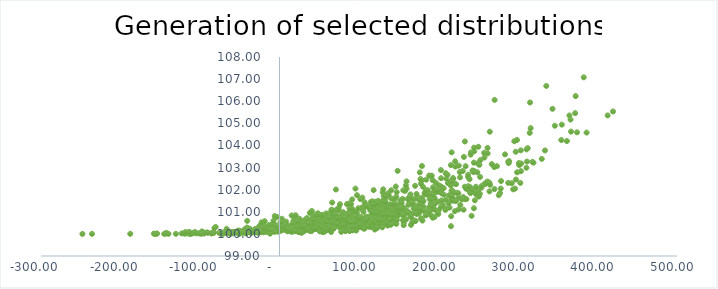
| Category | Correlated var #3 |
|---|---|
| 70.13736574690485 | 100.426 |
| 19.10571041543028 | 100.684 |
| 86.53325265311273 | 100.924 |
| 10.224716042911481 | 100.25 |
| 2.7844434325015612 | 100.472 |
| 50.62324087661004 | 100.227 |
| 135.6689059789775 | 101.107 |
| 28.135895519052667 | 100.163 |
| 111.51120475761911 | 100.426 |
| 3.915789887963953 | 100.482 |
| 206.46240858277238 | 102.068 |
| 72.52647121883795 | 100.448 |
| 96.75893116100633 | 100.522 |
| -82.99420742841542 | 100.074 |
| -21.026460256384823 | 100.263 |
| 132.98011242009767 | 101.541 |
| 100.62409422904001 | 100.522 |
| 35.4702051167384 | 100.345 |
| 66.28497581880447 | 100.454 |
| 142.0679507118041 | 100.706 |
| 48.2429117918072 | 100.931 |
| 220.58543666404887 | 101.027 |
| 163.50356792513918 | 101.389 |
| 66.26154855052383 | 101.419 |
| -11.659527865662781 | 100.102 |
| 121.8125656467173 | 101.257 |
| -42.234055803087216 | 100.022 |
| 16.238188086628583 | 100.183 |
| -31.385115082261564 | 100.089 |
| -19.10894126085067 | 100.204 |
| -123.04203688254728 | 100.021 |
| -63.87497666678976 | 100.066 |
| 364.689727690861 | 105.356 |
| 97.50634531323615 | 101.753 |
| 165.39422335604763 | 100.407 |
| 297.14401497043445 | 103.715 |
| 312.27854869371464 | 103.877 |
| 100.6996378911826 | 100.308 |
| 9.571786296818019 | 100.269 |
| 242.87250789040664 | 101.994 |
| 182.39015313720392 | 101.053 |
| 129.88131604136703 | 100.742 |
| -35.29739287146626 | 100.074 |
| -83.29278447788343 | 100.049 |
| 172.62753446745387 | 101.126 |
| -24.391184821393054 | 100.383 |
| 252.63506950674818 | 103.337 |
| 250.57953730473074 | 101.689 |
| 144.9413082034791 | 101.577 |
| -59.74193231537441 | 100.051 |
| 64.8776997184038 | 100.996 |
| 346.33106462406016 | 104.891 |
| 366.7119142921172 | 104.626 |
| 292.21170600949995 | 102.291 |
| 99.66632277146584 | 100.485 |
| 194.96386281601394 | 100.764 |
| -114.37280397930584 | 100.072 |
| 73.74694429238875 | 100.651 |
| 113.14679450857473 | 100.73 |
| 188.6951329966465 | 100.921 |
| 70.08570686742966 | 100.402 |
| 44.158392569535444 | 100.404 |
| -118.5820312265422 | 100.011 |
| 17.62032709282245 | 100.585 |
| 6.766472482448577 | 100.242 |
| 172.86765163948496 | 100.892 |
| 129.30955372293815 | 100.37 |
| 97.4135939539566 | 100.487 |
| 40.2372155583686 | 100.451 |
| 42.303154382710645 | 100.241 |
| 25.366278095030793 | 100.258 |
| 48.302545283291195 | 100.467 |
| -108.50829118722197 | 100.041 |
| 118.38803904547832 | 100.976 |
| 311.28699302898417 | 103.271 |
| 32.51385361896922 | 100.162 |
| 98.20943056783393 | 100.521 |
| 131.30929077411656 | 100.991 |
| 192.67855511253018 | 100.732 |
| -59.52445554793246 | 100.09 |
| 80.46408819243251 | 100.508 |
| 56.30543377817026 | 100.387 |
| 23.486753918768542 | 100.355 |
| 76.15404194591802 | 100.271 |
| 168.6385435145762 | 101.164 |
| 137.28093576583905 | 101.728 |
| 198.5862913346104 | 101.895 |
| 43.99745323735499 | 100.341 |
| 244.54984752789423 | 101.161 |
| 115.58567353495474 | 100.727 |
| 20.77671898499021 | 100.672 |
| 51.7717964494947 | 100.854 |
| 146.10813461751133 | 100.825 |
| 190.10140583664395 | 100.862 |
| 146.12255714842178 | 100.872 |
| 5.866170565615775 | 100.202 |
| 58.88076501131419 | 100.926 |
| 38.13862735725877 | 100.949 |
| 194.57046770484624 | 101.903 |
| 63.25460077799762 | 100.477 |
| 56.09144003197859 | 100.094 |
| 135.2675115737335 | 100.797 |
| 90.78698247925487 | 100.901 |
| 71.27354915416285 | 101.084 |
| 119.60497432876117 | 100.755 |
| 203.1765359950527 | 101.942 |
| 176.49334477884486 | 102.783 |
| 295.39655668883546 | 104.193 |
| 115.79098335229303 | 100.844 |
| 10.588893792287763 | 100.16 |
| 180.56830350712303 | 102.127 |
| 120.23993195863582 | 100.57 |
| 57.17555302798306 | 100.649 |
| 2.9482998637312363 | 100.685 |
| 24.736844905549475 | 100.125 |
| 104.19077606252158 | 101.641 |
| 67.38348586386451 | 100.6 |
| 13.24252883299593 | 100.361 |
| 4.362612274667484 | 100.542 |
| 167.66704454915384 | 100.641 |
| 31.49957929034001 | 100.578 |
| 14.686646985050345 | 100.213 |
| 40.655445754685175 | 100.678 |
| 133.1475974354761 | 100.572 |
| 89.97620372563082 | 101.347 |
| 177.9546321364109 | 102.276 |
| 129.16516056861795 | 101.449 |
| 16.94735356344809 | 100.145 |
| 39.163880494690936 | 100.404 |
| 79.10870584383379 | 100.59 |
| 239.22319487455377 | 101.911 |
| -10.5416446424056 | 100.189 |
| 217.3212510031694 | 101.96 |
| 131.4191993993312 | 100.455 |
| 216.45854129811516 | 101.95 |
| 132.59532355212386 | 101.248 |
| 382.67630440635367 | 107.081 |
| 107.0568915796515 | 101.199 |
| 195.58568765576138 | 101.091 |
| 249.72966513129654 | 101.869 |
| -104.6359125560254 | 100.023 |
| 195.4009483666157 | 101.892 |
| -142.43454668004375 | 100.043 |
| 76.3415294515611 | 100.692 |
| -9.067772901665961 | 100.238 |
| 128.02401958561018 | 100.617 |
| -1.3553971595900833 | 100.215 |
| 200.1879926358933 | 101.071 |
| -25.294426251588305 | 100.19 |
| 68.72858616880092 | 100.636 |
| -31.813937320242502 | 100.145 |
| 319.5228571715467 | 103.22 |
| -97.44651979942478 | 100.11 |
| 135.31400601444733 | 100.856 |
| -97.5189317695282 | 100.021 |
| 47.09119645672516 | 100.617 |
| 142.49903834738754 | 101.176 |
| 58.74775831645704 | 100.666 |
| 235.13456984180496 | 101.573 |
| -17.282878022796694 | 100.114 |
| 148.59941735184228 | 102.851 |
| 73.02441598143572 | 100.446 |
| 90.97508510851208 | 100.175 |
| 94.69331522104395 | 100.734 |
| 71.83127583921595 | 100.503 |
| 177.97862436376226 | 100.698 |
| 333.9598426719032 | 103.774 |
| 95.54349322086105 | 102.05 |
| 134.3359845751809 | 101.308 |
| 90.98024003439659 | 100.454 |
| 26.254995501256516 | 100.298 |
| 183.49117912993452 | 101.834 |
| 104.05333147549868 | 100.644 |
| 30.057584631078683 | 100.207 |
| 101.44143587792284 | 100.405 |
| 131.26727199272548 | 100.685 |
| 144.30214444605446 | 101.349 |
| 29.513469401109845 | 100.225 |
| 132.21343946695356 | 101.151 |
| 231.9863837231575 | 103.48 |
| 8.899029010674127 | 100.374 |
| -85.72050233706929 | 100.03 |
| 80.13587980581205 | 100.981 |
| 150.2008191431322 | 100.861 |
| 119.87470572935855 | 100.845 |
| 22.112983818772207 | 100.137 |
| -3.147989384685502 | 100.764 |
| 74.29376187587751 | 101.072 |
| 224.95591327211977 | 101.842 |
| 40.69477753943151 | 101.036 |
| 315.148119014057 | 105.944 |
| 22.29950095134845 | 100.288 |
| 30.10425646911557 | 100.435 |
| 192.73640133842594 | 101.241 |
| 189.5555980176835 | 101.208 |
| 30.27479179048207 | 100.106 |
| 165.581959603514 | 101.372 |
| 41.017660079597135 | 100.2 |
| 31.873604561535416 | 100.31 |
| 136.00711313265387 | 100.377 |
| 361.52344390180383 | 104.199 |
| -50.322700288306066 | 100.14 |
| 212.67434416927685 | 101.374 |
| 240.45415532501787 | 103.585 |
| 147.06516051754164 | 101.211 |
| 125.69134309281269 | 101.022 |
| 127.86031756699737 | 100.941 |
| 51.47972565295188 | 100.224 |
| 90.46330406877613 | 100.674 |
| 5.082139140100722 | 100.213 |
| -8.16556539345926 | 100.247 |
| 78.57715317747852 | 100.447 |
| 13.377090173686497 | 100.133 |
| 216.10222056161044 | 101.526 |
| 171.92481084426134 | 101.601 |
| -56.513387436567285 | 100.095 |
| -66.42524398714829 | 100.227 |
| -23.90291596034477 | 100.35 |
| 296.31852100457587 | 102.049 |
| 218.2664380964551 | 102.52 |
| 220.00188850269467 | 102.286 |
| 112.14292185978248 | 100.344 |
| 31.12933278660678 | 100.326 |
| 52.006767752142586 | 100.785 |
| 126.84032481213737 | 100.515 |
| 126.06688525814248 | 100.473 |
| 149.57673150032804 | 100.975 |
| 45.53298179993567 | 100.615 |
| 3.069975369206361 | 100.44 |
| 54.40239599081718 | 100.08 |
| 244.8621328318731 | 102.837 |
| 129.31282495945695 | 100.297 |
| 46.9128857417866 | 100.218 |
| 138.59623074920717 | 100.8 |
| 203.25164845294847 | 102.144 |
| 87.23881425118208 | 100.597 |
| 142.5934723978166 | 100.486 |
| 270.0849990118694 | 103.023 |
| 102.06735160988015 | 100.764 |
| 109.58915487329641 | 100.49 |
| 138.20340642565674 | 101.335 |
| 329.89914020477454 | 103.392 |
| 105.88831827121373 | 100.238 |
| 170.05911066093933 | 101.224 |
| 20.140112579457735 | 100.598 |
| 97.53660117205112 | 100.707 |
| 28.377865365051235 | 100.478 |
| 215.71691326037902 | 100.349 |
| -4.480459082270812 | 100.293 |
| 19.879604165363958 | 100.179 |
| 36.93684050220715 | 100.177 |
| 77.64495840011945 | 100.093 |
| 178.33038736247994 | 101.099 |
| 141.54961932786415 | 101.314 |
| -34.094257509420686 | 100.064 |
| 19.545994678569116 | 100.482 |
| -38.546324350957576 | 100.101 |
| -67.6396681400717 | 100.065 |
| 127.85977285836915 | 100.863 |
| 9.98528666810239 | 100.114 |
| 57.2850597213286 | 100.393 |
| 33.53983034787569 | 100.624 |
| 110.21745271257619 | 100.558 |
| 156.32157439275562 | 100.501 |
| -16.614947422820933 | 100.088 |
| 130.92909406224808 | 100.778 |
| 118.61063878803726 | 101.038 |
| 30.636110290356015 | 100.358 |
| 45.18844229689149 | 100.388 |
| 213.99663589120814 | 102.264 |
| 142.11568115571083 | 101.029 |
| -14.814715670205445 | 100.168 |
| 4.419708562871392 | 100.434 |
| -37.27708835789221 | 100.235 |
| 253.9860845773343 | 102.09 |
| 58.11393154291773 | 100.142 |
| 244.94261303609565 | 103.736 |
| 234.89653645006123 | 102.04 |
| 116.42947548450238 | 100.392 |
| 65.25163815163867 | 100.805 |
| 172.42017215701367 | 101.805 |
| 301.56673053313557 | 103.113 |
| 200.567835610809 | 102.196 |
| 31.39376328805328 | 100.234 |
| 233.07015519602868 | 101.57 |
| 45.5308505096006 | 100.213 |
| 90.57296810635991 | 100.739 |
| -43.80814063577844 | 100.209 |
| -49.84570660861169 | 100.027 |
| -30.044476651743082 | 100.201 |
| 239.56630344586566 | 101.949 |
| 134.56046876179576 | 100.949 |
| 237.27439843980926 | 102.571 |
| 106.46630394290604 | 100.408 |
| -106.40277493903193 | 100.084 |
| 107.90097263779745 | 101.309 |
| 304.07615457382076 | 103.183 |
| -154.1667918773617 | 100.015 |
| 270.58665334363883 | 106.06 |
| 203.5681918012921 | 102.029 |
| 91.79340396060996 | 100.161 |
| 164.74284518610148 | 101.786 |
| 13.611567214738585 | 100.262 |
| 215.96235477548626 | 100.802 |
| 128.2297786291095 | 101.23 |
| 122.33653830869515 | 100.711 |
| 42.687926089261424 | 100.234 |
| 230.51524139216363 | 102.842 |
| -25.4343919252712 | 100.207 |
| 118.85839796521165 | 101.307 |
| -36.288162981279555 | 100.051 |
| 175.6009448333739 | 100.943 |
| -28.55243942348403 | 100.066 |
| 108.09915686481806 | 100.513 |
| 218.06871354334376 | 101.6 |
| 152.01540038760248 | 101.509 |
| 211.92697582154716 | 102.298 |
| 66.89567770331928 | 100.792 |
| 24.57060425545545 | 100.105 |
| 86.19269928980809 | 100.688 |
| 65.98156144424698 | 101.074 |
| -19.98750635705801 | 100.126 |
| -8.970390347453716 | 100.432 |
| 127.71687632590937 | 100.813 |
| 83.56568668184784 | 100.448 |
| 154.76050226495497 | 101.206 |
| 248.82363425704096 | 102.787 |
| -117.00164186096868 | 100.03 |
| 213.23565758787646 | 101.746 |
| 114.16822123546048 | 101.068 |
| 19.774823236649254 | 100.468 |
| 62.89279942155722 | 100.68 |
| -70.68584297113316 | 100.05 |
| 64.56129382737839 | 100.542 |
| 1.0065508937729817 | 100.253 |
| 244.4589481299658 | 103.222 |
| 84.02925973954127 | 100.539 |
| 23.319604547765437 | 100.509 |
| 203.23058269564763 | 102.519 |
| 29.42385787141336 | 100.347 |
| 252.04003118143706 | 101.81 |
| 37.844669005677595 | 100.415 |
| 133.22450043900898 | 100.989 |
| 371.9177047073935 | 105.461 |
| 150.23969573499872 | 101.074 |
| 77.61424215376817 | 100.43 |
| 54.32133327610002 | 100.277 |
| 186.51090681242022 | 101.973 |
| 177.97126553623752 | 101.11 |
| 128.41613098224448 | 100.68 |
| 72.25705273812802 | 100.395 |
| 112.70644890575511 | 100.336 |
| 134.4762253294228 | 101.191 |
| 244.73834599489126 | 103.901 |
| -19.60399326295409 | 100.214 |
| 58.85782052713242 | 100.271 |
| 123.4200942303446 | 100.332 |
| 122.42427707753757 | 101.117 |
| 250.7226953091157 | 101.722 |
| 32.557394821050906 | 100.648 |
| 240.16557768950756 | 101.84 |
| -59.85730814223837 | 100.081 |
| 264.522511762441 | 104.622 |
| 5.146097096197153 | 100.355 |
| 9.06903221216271 | 100.197 |
| 9.909031545725 | 100.163 |
| 249.19227530218927 | 103.189 |
| 190.80171859256558 | 102.609 |
| 157.6551222187986 | 101.064 |
| 303.6877619188806 | 102.838 |
| -82.88808254948117 | 100.08 |
| 293.9450158971165 | 102.016 |
| 98.33592465801915 | 100.701 |
| -21.528040635905256 | 100.183 |
| 141.36533350040244 | 100.957 |
| 117.21197976880998 | 100.63 |
| 335.5874155432114 | 106.691 |
| 54.978001579318594 | 100.865 |
| 247.5876732837705 | 102.014 |
| 162.08131750478634 | 101.314 |
| 163.587636056286 | 100.951 |
| -51.187839791357476 | 100.095 |
| 68.91978667809053 | 100.803 |
| 185.16655652101352 | 101.783 |
| 144.0555523941033 | 100.682 |
| -36.5224398814739 | 100.073 |
| 355.0926861175086 | 104.942 |
| -80.2679396179133 | 100.314 |
| 140.0062256693058 | 101.12 |
| 203.83503552023708 | 101.842 |
| -21.360080850559328 | 100.241 |
| 95.38335572738329 | 100.513 |
| 118.57023464582636 | 100.946 |
| 183.80873099377095 | 101.799 |
| 168.47441942427022 | 100.96 |
| -139.62075405846565 | 100.004 |
| -47.301114200797485 | 100.098 |
| 97.32579590999369 | 100.962 |
| 258.50326284630944 | 102.281 |
| 129.81497159120605 | 101.879 |
| 301.19093159007764 | 103.203 |
| 131.20540501134957 | 101.292 |
| -82.93320323296115 | 100.048 |
| 124.13423625864584 | 101.495 |
| -18.844830027128353 | 100.195 |
| 209.77288117336536 | 102.502 |
| 121.32433432320089 | 100.748 |
| 170.57999918368074 | 102.172 |
| 58.6786229204623 | 100.174 |
| -2.1153662053305027 | 100.107 |
| 124.59186472057876 | 100.472 |
| 200.51085410829265 | 102.008 |
| 94.08988952838922 | 101.026 |
| 251.45230430635695 | 103.122 |
| 248.88432112641226 | 101.865 |
| 134.81391009224387 | 100.707 |
| -23.575245645643122 | 100.081 |
| 105.0558882963084 | 101.173 |
| 93.92180211691351 | 100.449 |
| 27.620301184777503 | 100.049 |
| 117.30005383569689 | 100.659 |
| 199.67594670965406 | 100.899 |
| 143.99347906408184 | 100.947 |
| 125.93753930264604 | 101.085 |
| 61.10348769835641 | 100.684 |
| 76.66591460197931 | 100.834 |
| 7.005416980505416 | 100.467 |
| 20.566261348206083 | 100.236 |
| 119.85301619318895 | 100.197 |
| -55.23478533261596 | 100.086 |
| 209.0371958733204 | 102.744 |
| 155.87413265392928 | 100.827 |
| 315.9429210111299 | 104.783 |
| -22.507765982698146 | 100.524 |
| 18.030333572979885 | 100.56 |
| -51.471345350542464 | 100.103 |
| -62.4356389737799 | 100.015 |
| 54.39503767625607 | 100.217 |
| 297.3871637074354 | 102.458 |
| 60.51147999806161 | 100.258 |
| 147.81767130965505 | 100.804 |
| 129.79267812478747 | 101.134 |
| 119.05412408624309 | 100.938 |
| 239.9049058180457 | 102.108 |
| 154.86447311224407 | 101.586 |
| 25.541627255463794 | 100.281 |
| -35.725317558995215 | 100.067 |
| -26.145729570607458 | 100.308 |
| -20.45211591107322 | 100.073 |
| 86.14550748373195 | 100.243 |
| -144.99433202993654 | 100.001 |
| 215.62752974649464 | 101.748 |
| 132.94439844140396 | 101.002 |
| 161.35247902644784 | 101.577 |
| 120.9921105494275 | 101.358 |
| -26.043568266790047 | 100.096 |
| 155.27623252535196 | 100.621 |
| -25.498088932817282 | 100.199 |
| 178.57497108365067 | 102.432 |
| 219.00966631960358 | 101.863 |
| 56.26917388588058 | 100.158 |
| 50.63712173925311 | 100.246 |
| 98.33059418424202 | 100.772 |
| 97.67104474558727 | 100.645 |
| 7.802132166550294 | 100.177 |
| 140.73343430957897 | 101.598 |
| -51.07935349391312 | 100.02 |
| 121.17655521491886 | 101.456 |
| 155.4910839213665 | 101.166 |
| 74.69901764825697 | 101.19 |
| 137.6522061678035 | 100.995 |
| 80.2175131999193 | 100.442 |
| 205.4230943400817 | 101.328 |
| 140.89225179562766 | 100.695 |
| 30.03708990652372 | 100.199 |
| 157.9761227524423 | 101.945 |
| 60.18613008198764 | 100.533 |
| 187.95965412343008 | 101.2 |
| 148.99360214777903 | 101.025 |
| 102.25833676725158 | 100.307 |
| -38.24137282684245 | 100.153 |
| 195.22681349144352 | 101.358 |
| 64.97630942680601 | 100.088 |
| 87.76957940879703 | 100.974 |
| 0.3691232688316859 | 100.123 |
| 218.51158161046882 | 102.503 |
| 84.6429373807576 | 100.812 |
| 298.7351037709523 | 104.246 |
| 52.38570989528911 | 100.568 |
| 58.6298989680665 | 100.504 |
| 20.220882612440263 | 100.844 |
| 200.52804467047636 | 101.996 |
| 134.11127442379703 | 100.644 |
| -51.86703689928777 | 100.152 |
| 185.45150053056523 | 101.834 |
| 192.716501661146 | 101.172 |
| 13.802714560124855 | 100.151 |
| 190.58371914972366 | 101.16 |
| 80.01537824139706 | 100.474 |
| 27.72420346337742 | 100.385 |
| 24.979645590275567 | 100.683 |
| 283.68424436123485 | 103.596 |
| 71.9873066014664 | 100.617 |
| 49.02835737672781 | 100.878 |
| 215.59819405316583 | 103.111 |
| 83.00779917210308 | 100.118 |
| 70.43453916721862 | 100.73 |
| 237.3735475111955 | 102.68 |
| 167.8099482807313 | 101.571 |
| 225.27132531090194 | 101.107 |
| -51.48357316526008 | 100.014 |
| 119.04351039231429 | 100.415 |
| 108.82781194367986 | 100.782 |
| 225.20650772462258 | 101.65 |
| 98.13995807412306 | 100.748 |
| 166.09122111161082 | 100.867 |
| 56.50026685556158 | 100.321 |
| -71.0342987320715 | 100.031 |
| -71.07589073182558 | 100.002 |
| 125.09379218820737 | 100.921 |
| 233.19568092952417 | 104.181 |
| 136.5421433908997 | 101.829 |
| 287.7912017441555 | 103.268 |
| 82.90531032205342 | 100.389 |
| 96.4339796425379 | 100.151 |
| 30.631264462010307 | 100.279 |
| 174.20784291347445 | 101.271 |
| 172.54070660069596 | 101.282 |
| 103.70293145590549 | 101.191 |
| 211.35207285336259 | 102.675 |
| 150.1862826898441 | 100.964 |
| 227.4069928900346 | 101.313 |
| 366.07723592736403 | 105.172 |
| 199.0979862504957 | 101.455 |
| 46.933762822156865 | 100.318 |
| 60.562999787479946 | 100.404 |
| 140.56852243562068 | 101.975 |
| 56.59597847791363 | 100.504 |
| 130.06824551275247 | 101.505 |
| -16.792293745347237 | 100.319 |
| 112.44115496547862 | 101.201 |
| 68.43601108420621 | 100.345 |
| 157.27694196998635 | 101.058 |
| 145.91570134018494 | 101.109 |
| 288.91152475628974 | 103.288 |
| 5.115470412983541 | 100.401 |
| -66.67858451495914 | 100.039 |
| 21.69562503446768 | 100.143 |
| 62.31288646992019 | 100.734 |
| 196.61525349115345 | 102.314 |
| 104.72877016123813 | 100.677 |
| 47.13856594696662 | 100.368 |
| 16.687270963022172 | 100.469 |
| 72.35256016082369 | 100.792 |
| -18.926153312544614 | 100.376 |
| 239.09924916737762 | 102.475 |
| -0.07685764198537015 | 100.194 |
| 11.231400019032549 | 100.325 |
| 191.78239641400597 | 101.119 |
| 65.85602714660034 | 100.922 |
| 157.25682175656414 | 101.141 |
| 115.82964631341073 | 101.195 |
| 116.60633675004703 | 100.632 |
| 34.58801868251406 | 100.714 |
| 61.99660932926888 | 100.351 |
| 147.82284039726554 | 101.102 |
| -90.00995959838215 | 100.049 |
| 111.67300407582944 | 100.773 |
| 122.74789834812881 | 100.269 |
| -112.96856972770826 | 100.005 |
| 15.302073564754934 | 100.833 |
| 213.85133317194925 | 101.188 |
| 47.96237968536786 | 100.437 |
| 80.33713419310777 | 100.44 |
| 70.42715875186879 | 100.732 |
| 55.433679845262176 | 100.227 |
| 247.06200140265528 | 101.801 |
| 190.12265408971308 | 101.38 |
| 176.88902364431584 | 101.059 |
| 81.54102489386115 | 100.282 |
| 258.5454082755896 | 102.25 |
| 190.02139644151276 | 101.791 |
| 51.1113964441139 | 100.172 |
| 23.788905084767492 | 100.098 |
| 30.868304874940364 | 100.598 |
| 53.80187416888242 | 100.296 |
| 66.98626546147386 | 101.012 |
| 96.34761279646699 | 100.466 |
| 218.8293152862271 | 101.498 |
| 159.83398613440187 | 102.045 |
| 78.7812185930815 | 100.372 |
| -58.2414229803544 | 100.025 |
| -35.55893907339757 | 100.063 |
| 38.624482935359346 | 100.429 |
| 91.97496933870283 | 100.35 |
| -187.74606928050775 | 100.004 |
| 10.115436665279134 | 100.168 |
| 156.9843935523567 | 100.898 |
| 109.78656925222943 | 100.675 |
| 166.85654198519845 | 100.511 |
| 37.98240016649485 | 100.317 |
| 91.50939005427212 | 101.562 |
| 88.18545206022924 | 100.129 |
| 36.73657386325364 | 100.306 |
| 47.524518882960045 | 100.374 |
| 310.75910190389436 | 103.822 |
| 240.78326842072545 | 103.683 |
| 48.53453414442443 | 100.445 |
| 287.7130241127586 | 102.308 |
| 180.7580786395575 | 101.25 |
| 85.95661640338037 | 100.793 |
| 249.95052413861015 | 101.953 |
| 151.10173731497088 | 101.204 |
| 21.790972477769444 | 100.484 |
| 135.50568149623572 | 100.491 |
| 91.11640657502826 | 101.143 |
| -12.8072570566936 | 100.183 |
| 22.807098441970822 | 100.347 |
| -53.995218630175515 | 100.056 |
| 81.99847310449526 | 100.434 |
| 261.81820198458956 | 103.64 |
| 242.67758276431917 | 101.999 |
| 203.65380780421867 | 101.513 |
| 108.97752842401277 | 100.606 |
| 237.5228555167422 | 102.158 |
| 86.358940382172 | 100.567 |
| 72.46276078385499 | 100.477 |
| 277.37224827828004 | 101.845 |
| -23.33485649161247 | 100.234 |
| 107.07861780034679 | 100.243 |
| 34.81364256298704 | 100.524 |
| 110.93022880043011 | 100.724 |
| 220.98149509219314 | 103.281 |
| -1.302550871043806 | 100.242 |
| -41.33970045089788 | 100.057 |
| 164.71407865703338 | 101.646 |
| 66.80350060140916 | 100.441 |
| 143.5341912020241 | 100.742 |
| 95.49104864709327 | 100.308 |
| 179.1987475871316 | 101.618 |
| 215.3684033779515 | 102.19 |
| 209.29082154330615 | 101.147 |
| -13.036978227100363 | 100.402 |
| 247.1520462837533 | 102.131 |
| 68.18441889565527 | 100.425 |
| 125.22129988422701 | 100.586 |
| 37.927860356314945 | 100.134 |
| 52.20192543869805 | 100.485 |
| 4.995724864646533 | 100.291 |
| -3.533622086320591 | 100.156 |
| 140.98430761157525 | 100.804 |
| 354.42803205056595 | 104.244 |
| 48.03127184694021 | 100.244 |
| 138.99390944464432 | 101.001 |
| 254.60129470508343 | 102.172 |
| 131.03144291076111 | 101.716 |
| 159.27793894768234 | 100.66 |
| 40.226365814755304 | 100.122 |
| -15.919838227618754 | 100.141 |
| -4.778306740461915 | 100.389 |
| 55.48175554612187 | 100.434 |
| -120.17685094445767 | 100.02 |
| -50.38008969050293 | 100.007 |
| 177.03325797722314 | 101.618 |
| -0.6302569831744336 | 100.186 |
| -10.145231462077916 | 100.197 |
| 245.74650923380742 | 101.52 |
| -6.191379514672832 | 100.197 |
| 35.260142395318255 | 100.67 |
| 74.02329784008208 | 100.713 |
| -143.20265759392382 | 100.015 |
| 132.52134068296203 | 101.41 |
| 96.68716820745117 | 100.451 |
| 5.071695105558504 | 100.321 |
| 10.55598405257625 | 100.193 |
| 51.08472507976171 | 100.418 |
| 49.47790222714046 | 100.212 |
| 156.25963753167878 | 100.394 |
| 188.90979554461384 | 101.58 |
| 42.69141094884456 | 100.22 |
| 148.42289752752444 | 101.303 |
| 2.448285442232745 | 100.234 |
| 23.148771316861968 | 100.302 |
| -40.83402976394228 | 100.288 |
| -158.02074468871137 | 100.009 |
| 58.542594735734205 | 100.352 |
| 54.70039443410022 | 100.306 |
| -30.492229916414914 | 100.075 |
| 192.66895642124496 | 102.429 |
| 92.24683446881453 | 100.631 |
| 139.88957471084328 | 100.411 |
| 82.9623535928051 | 100.902 |
| -247.8944963620168 | 100.001 |
| 221.29330223890275 | 103.045 |
| 13.17946841342146 | 100.277 |
| -19.705349103302325 | 100.161 |
| 86.64722531049937 | 100.767 |
| 8.93688474394041 | 100.279 |
| 8.293284240706967 | 100.554 |
| 203.04078915298504 | 102.887 |
| -95.00106847582964 | 100.015 |
| 114.71985129570625 | 101.434 |
| 69.79159653003872 | 100.745 |
| 94.9251491607621 | 100.531 |
| 125.84483729134197 | 100.664 |
| -38.90825041777859 | 100.128 |
| 143.15296946268646 | 101.321 |
| 195.31440853862213 | 102.02 |
| 123.60120728171444 | 100.638 |
| 6.16772435221074 | 100.425 |
| -94.86322640040552 | 100.051 |
| -81.84295923573637 | 100.267 |
| -1.7308054573079517 | 100.113 |
| -18.599038684819163 | 100.573 |
| 275.809089683249 | 101.753 |
| 267.11640270087224 | 103.157 |
| -113.06349636006104 | 100.009 |
| -5.993734637382232 | 100.089 |
| 143.55702318565085 | 101.362 |
| -73.9031339911983 | 100.01 |
| 28.44736816035703 | 100.32 |
| 53.96089401548774 | 100.269 |
| 42.3266195074033 | 100.799 |
| 139.76055415263926 | 100.935 |
| 155.68985635192203 | 101.97 |
| 386.2479375707896 | 104.582 |
| -41.7000012645542 | 100.036 |
| 50.9123845200153 | 100.111 |
| 191.47769896822695 | 102.634 |
| 116.05275147434924 | 100.999 |
| 70.94106971724419 | 102.008 |
| 101.66826036062234 | 101.573 |
| 18.636367135269154 | 100.117 |
| 65.43990357923491 | 101.094 |
| 54.12507591381943 | 100.469 |
| 278.3012863666351 | 102.051 |
| 70.02790668785383 | 100.473 |
| -154.40874027178972 | 100.01 |
| 145.33396897059822 | 101.332 |
| 148.11865909272555 | 101.155 |
| 30.046261351518396 | 100.269 |
| -53.262806207458 | 100.061 |
| 195.09944294046517 | 101.621 |
| 226.85675759017371 | 102.797 |
| 85.08586485505879 | 100.671 |
| 116.57003576399372 | 101.474 |
| -118.44612703555813 | 100.08 |
| 314.76116181409657 | 104.569 |
| 99.22884537835594 | 101.162 |
| 242.8306884987539 | 102.869 |
| 184.5193244945035 | 102.451 |
| 144.5942806911131 | 101.384 |
| 153.6107475358916 | 101.412 |
| 1.9121554588960379 | 100.245 |
| 180.7361655344132 | 101.064 |
| 64.71843841380641 | 100.194 |
| 20.97287483990509 | 100.192 |
| -76.03959079343525 | 100.051 |
| 102.35386957838116 | 100.409 |
| -22.298150148395564 | 100.203 |
| 21.06031184264522 | 100.39 |
| 21.50599074508149 | 100.316 |
| 215.52985093576365 | 102.382 |
| 171.65463794883834 | 101.14 |
| 130.47572808876242 | 102.018 |
| 234.15423196733425 | 103.06 |
| 62.81679695207345 | 100.195 |
| 261.71545804079136 | 103.889 |
| -16.431048157899852 | 100.189 |
| 177.37692444822488 | 101.338 |
| -7.532616247243865 | 100.597 |
| 24.070592093971356 | 100.685 |
| -11.797360021104595 | 100.011 |
| 84.09024389767909 | 100.501 |
| 171.1757491922222 | 100.586 |
| 193.15571214868174 | 102.107 |
| 61.73667531416372 | 100.357 |
| 241.5961502782652 | 100.818 |
| -4.300883479060317 | 100.355 |
| 231.12622799044402 | 101.665 |
| 121.11410718451984 | 100.95 |
| 252.34668622896427 | 102.576 |
| 85.71326099590738 | 100.645 |
| 130.1402047608677 | 101.467 |
| 136.72505289746172 | 100.71 |
| 243.65995678808568 | 102.839 |
| 45.17695214913015 | 100.744 |
| 151.6342678261401 | 101.1 |
| 264.9247238438959 | 102.218 |
| 115.59264396845866 | 100.728 |
| 343.38560087645294 | 105.658 |
| 318.1372618685822 | 103.259 |
| 128.59183774736204 | 101.046 |
| -101.35247802122493 | 100.03 |
| 69.31098328814835 | 100.332 |
| 89.85487873715964 | 100.32 |
| 216.70135530008392 | 101.532 |
| 151.2144761749222 | 101.161 |
| 84.88043923586186 | 101.347 |
| 153.97257878019443 | 101.204 |
| 203.25840748306956 | 101.232 |
| 73.70259998979452 | 100.628 |
| 270.40717637439104 | 102.027 |
| 15.257486366967257 | 100.09 |
| 222.61777902503138 | 101.858 |
| 143.55727293284926 | 101.036 |
| 15.748262942705793 | 100.192 |
| 108.01174451634398 | 100.635 |
| 66.54589620831194 | 100.228 |
| 233.13796505767658 | 102.132 |
| 41.8741595204445 | 100.636 |
| 9.328286735985685 | 100.297 |
| 46.943497564695676 | 100.509 |
| -30.702560340369473 | 100.216 |
| 66.88944367604347 | 100.501 |
| 374.25383438295273 | 104.594 |
| 12.107825909624111 | 100.203 |
| 73.45691139925452 | 100.684 |
| 56.86851157793743 | 100.261 |
| 88.07522082489552 | 101.155 |
| 186.8518819096712 | 101.793 |
| 147.48551966837118 | 101.891 |
| -14.413322357598446 | 100.21 |
| 75.06591394342351 | 100.531 |
| 55.591436515604414 | 100.191 |
| 260.3183847087221 | 102.288 |
| 182.42184352378064 | 101.849 |
| 167.5137553015508 | 101.408 |
| 6.183994885991709 | 100.25 |
| -50.3218455015662 | 100.085 |
| 115.24375240060094 | 100.315 |
| 47.520211144522804 | 100.303 |
| 118.40365124028182 | 101.979 |
| -130.3185425906022 | 100.002 |
| 191.7947752997825 | 101.286 |
| 273.4941055922976 | 103.063 |
| 132.55658047141912 | 101.446 |
| 159.82929142263268 | 102.374 |
| 176.66259302377225 | 101.156 |
| 37.562977812140495 | 100.298 |
| 113.20975277475861 | 100.337 |
| 146.87683952074104 | 101.68 |
| -10.554034102959164 | 100.194 |
| 257.7410699966674 | 103.453 |
| -70.48222659860005 | 100.064 |
| -46.59743569051241 | 100.043 |
| 83.8508481706172 | 100.841 |
| 198.96870736311558 | 100.946 |
| 14.063845908237653 | 100.29 |
| 278.69932976283695 | 102.391 |
| 85.29341562383391 | 100.602 |
| 208.59550756313593 | 101.085 |
| 66.56052124998956 | 100.276 |
| 250.09104514646324 | 103.94 |
| 146.23990062891713 | 102.143 |
| 103.65467944090464 | 101.129 |
| 0.687852758358872 | 100.23 |
| 310.58949990066174 | 102.991 |
| 187.4166169581776 | 101.014 |
| 191.40462854079402 | 101.564 |
| 146.94248090073137 | 100.453 |
| 107.08420922397309 | 101.431 |
| 5.598940077387098 | 100.321 |
| 31.022246954516135 | 100.282 |
| 229.35106297987605 | 101.565 |
| 105.59403348639586 | 101 |
| 288.283599237687 | 103.204 |
| 222.06373006405136 | 102.251 |
| -110.98793991294241 | 100.003 |
| -48.31457383993211 | 100.1 |
| -31.77199641628087 | 100.102 |
| 144.28210045051324 | 100.856 |
| 163.57796560795023 | 101.669 |
| 191.30800647382623 | 101.816 |
| 89.68418439985926 | 100.53 |
| 24.260156735541614 | 100.078 |
| -61.85714086842492 | 100.005 |
| 57.77206573413879 | 100.485 |
| 11.51023628319939 | 100.199 |
| 155.98421923498367 | 100.861 |
| 7.662814537506279 | 100.239 |
| 43.84499682886584 | 100.626 |
| 68.32360250663643 | 100.242 |
| 221.97537681949154 | 101.49 |
| 184.2928992227701 | 101.97 |
| 261.50819981622726 | 102.369 |
| 128.2462663464041 | 100.617 |
| -41.15701282022485 | 100.233 |
| 5.417813605984705 | 100.322 |
| 101.77581002378946 | 100.743 |
| 129.53305817227127 | 100.878 |
| 47.11790467883007 | 100.474 |
| 61.835352458801935 | 100.293 |
| 160.62323024379256 | 101.034 |
| 54.54625286837248 | 100.164 |
| 2.9632055823591372 | 100.163 |
| 32.63282139004717 | 100.37 |
| 76.03583364828096 | 101.342 |
| 158.94527879139693 | 102.201 |
| 264.0047110301482 | 102.319 |
| -5.980202480714624 | 100.806 |
| 15.152612872554243 | 100.144 |
| 164.7442581036659 | 100.785 |
| -54.04311149025847 | 100.077 |
| 264.10659712012443 | 101.924 |
| 178.8535830443356 | 100.691 |
| -26.468132491648532 | 100.049 |
| 179.80685443637987 | 100.602 |
| 225.48596583869943 | 103.088 |
| 32.82616713013395 | 100.191 |
| 188.30233381553938 | 102.639 |
| 216.54144211753032 | 103.689 |
| 197.23439732838526 | 101.976 |
| 70.09691311805994 | 100.875 |
| 98.50282555862398 | 100.719 |
| 34.714254328151526 | 100.214 |
| 113.23519252351566 | 100.485 |
| 9.291368600652262 | 100.216 |
| 54.64726374044378 | 100.119 |
| 176.2673728660338 | 101.522 |
| 73.24971843939416 | 100.542 |
| -47.2715122357383 | 100.093 |
| 20.322047393590893 | 100.137 |
| 118.37260785782573 | 100.518 |
| 257.44633415396856 | 103.667 |
| 227.15239370025756 | 102.558 |
| 231.4901854457832 | 101.096 |
| -113.42781707510659 | 100.087 |
| 12.562504040815071 | 100.194 |
| 80.35739525144945 | 100.408 |
| 59.388713677514076 | 100.285 |
| 177.40070608630998 | 102.48 |
| 141.64774733261862 | 100.845 |
| 110.07238298374071 | 100.353 |
| 48.559247068298866 | 100.385 |
| -19.74488468975288 | 100.29 |
| 97.30820838238913 | 100.333 |
| -23.524415194390144 | 100.236 |
| 87.95033344663787 | 101.382 |
| 28.37911275372352 | 100.511 |
| 99.700457001596 | 100.596 |
| 136.9094891826606 | 101.807 |
| 29.371217577737085 | 100.361 |
| -0.5320586088678425 | 100.23 |
| 179.17309502595867 | 103.069 |
| 72.63685338252753 | 100.449 |
| -235.84534489707124 | 100 |
| -99.08215726736884 | 100.006 |
| 372.507162300809 | 106.233 |
| 57.182440340715175 | 100.377 |
| 100.23683725185565 | 100.426 |
| 138.3522824657721 | 100.63 |
| 303.4890531296138 | 103.778 |
| 184.209421884891 | 100.883 |
| 3.291519647522236 | 100.336 |
| 135.55945190268935 | 100.876 |
| 57.07080054583909 | 100.195 |
| 206.54151184024795 | 101.779 |
| 109.02574595910724 | 101.279 |
| 38.66539667016622 | 100.478 |
| -156.61568784014872 | 100.001 |
| 216.5751767250801 | 101.7 |
| 181.17696436833722 | 101.482 |
| 247.22802449115912 | 101.896 |
| -24.306566189288134 | 100.107 |
| 84.13604648268318 | 100.608 |
| 117.42143102390148 | 101.338 |
| -85.61902441331591 | 100.023 |
| 244.27221146758228 | 102.797 |
| 98.94218850953483 | 100.736 |
| 31.15603520744851 | 100.333 |
| 72.4714247062159 | 100.69 |
| 87.88302228321335 | 100.886 |
| 184.17538287803677 | 100.84 |
| 58.357514514164805 | 100.544 |
| 116.17357844169383 | 100.602 |
| 52.81479245160627 | 100.309 |
| 82.15322092492981 | 100.726 |
| 1.3884758053673352 | 100.535 |
| 170.31919110471483 | 100.59 |
| 22.48292770490788 | 100.562 |
| 302.92411235781435 | 102.307 |
| 36.30369444775843 | 100.461 |
| -40.61183037764238 | 100.589 |
| 419.5242720967236 | 105.537 |
| 147.67487085026514 | 100.628 |
| 193.2442912314968 | 101.763 |
| 152.6268919446657 | 101.177 |
| 76.32927736082438 | 100.715 |
| 133.33157264792436 | 101.713 |
| 209.3622063382469 | 101.548 |
| -91.21421566357205 | 100.068 |
| 46.084101808483176 | 100.264 |
| 53.36040542203946 | 100.316 |
| -34.38508924186851 | 100.13 |
| 412.74322871096246 | 105.359 |
| 298.8968004286646 | 102.786 |
| 45.89441393972895 | 100.868 |
| 124.07715185270311 | 101.396 |
| 160.51872190105178 | 100.961 |